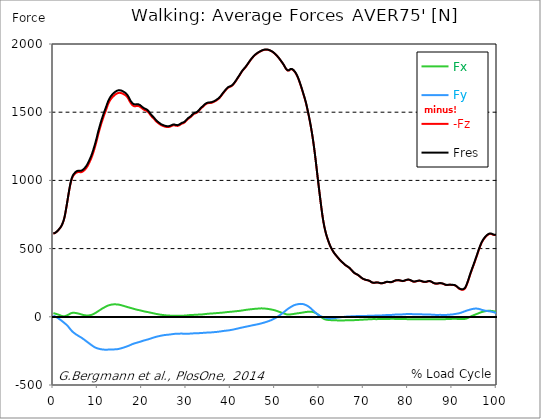
| Category |  Fx |  Fy |  -Fz |  Fres |
|---|---|---|---|---|
| 0.0 | 26.993 | 8.933 | 609.194 | 610.314 |
| 0.16678370786516855 | 25.712 | 6.523 | 611.267 | 612.345 |
| 0.3335674157303371 | 24.136 | 3.801 | 613.77 | 614.781 |
| 0.5003511235955057 | 22.375 | 1.037 | 616.677 | 617.629 |
| 0.6671348314606742 | 20.613 | -2.149 | 620.731 | 621.666 |
| 0.8339185393258427 | 19.02 | -5.444 | 625.307 | 626.217 |
| 1.0007022471910114 | 17.318 | -8.866 | 630.675 | 631.585 |
| 1.1674859550561796 | 15.473 | -12.658 | 636.911 | 637.838 |
| 1.3342696629213484 | 13.332 | -16.425 | 643.409 | 644.378 |
| 1.5010533707865168 | 11.107 | -19.947 | 649.695 | 650.707 |
| 1.6678370786516854 | 8.984 | -23.79 | 657.373 | 658.468 |
| 1.8346207865168538 | 7.104 | -28.063 | 666.777 | 667.974 |
| 2.001404494382023 | 5.385 | -32.546 | 677.699 | 679.039 |
| 2.1681882022471908 | 4.273 | -36.928 | 691.124 | 692.607 |
| 2.334971910112359 | 3.775 | -41.117 | 707.144 | 708.813 |
| 2.501755617977528 | 3.927 | -45.449 | 726.493 | 728.373 |
| 2.668539325842697 | 5.275 | -50.218 | 752.702 | 754.818 |
| 2.8353230337078656 | 7.29 | -55.014 | 782.973 | 785.341 |
| 3.0021067415730336 | 9.228 | -59.463 | 814.314 | 816.91 |
| 3.168890449438202 | 11.571 | -64.772 | 846.625 | 849.532 |
| 3.335674157303371 | 14.217 | -70.798 | 879.862 | 883.191 |
| 3.502457865168539 | 17.402 | -77.607 | 912.375 | 916.201 |
| 3.6692415730337076 | 20.731 | -84.644 | 943.168 | 947.559 |
| 3.8360252808988764 | 23.832 | -91.453 | 970.371 | 975.318 |
| 4.002808988764046 | 26.479 | -98.018 | 993.462 | 998.957 |
| 4.169592696629214 | 28.282 | -104.01 | 1011.48 | 1017.531 |
| 4.3363764044943816 | 29.192 | -109.269 | 1024.626 | 1031.208 |
| 4.50316011235955 | 29.344 | -113.895 | 1034.554 | 1041.591 |
| 4.669943820224718 | 29.234 | -118.235 | 1041.827 | 1049.302 |
| 4.836727528089888 | 28.931 | -122.449 | 1047.869 | 1055.765 |
| 5.003511235955056 | 28.282 | -126.536 | 1052.866 | 1061.193 |
| 5.170294943820225 | 27.304 | -130.109 | 1056.903 | 1065.6 |
| 5.337078651685394 | 26.066 | -133.413 | 1059.524 | 1068.583 |
| 5.5038623595505625 | 24.827 | -136.809 | 1060.628 | 1070.092 |
| 5.670646067415731 | 23.681 | -140.281 | 1061.235 | 1071.128 |
| 5.837429775280899 | 22.341 | -143.652 | 1061.311 | 1071.626 |
| 6.004213483146067 | 20.605 | -146.694 | 1060.139 | 1070.842 |
| 6.170997191011236 | 18.835 | -149.787 | 1059.381 | 1070.48 |
| 6.329002808988764 | 17.166 | -153.175 | 1060.139 | 1071.676 |
| 6.495786516853932 | 15.582 | -156.841 | 1062.431 | 1074.44 |
| 6.662570224719101 | 14.074 | -160.633 | 1065.76 | 1078.283 |
| 6.82935393258427 | 12.742 | -164.434 | 1069.906 | 1082.918 |
| 6.9961376404494375 | 11.68 | -168.378 | 1074.617 | 1088.152 |
| 7.162921348314607 | 10.905 | -172.49 | 1080.053 | 1094.135 |
| 7.329705056179775 | 10.366 | -176.679 | 1086.534 | 1101.189 |
| 7.496488764044945 | 10.029 | -180.875 | 1093.806 | 1109.026 |
| 7.663272471910113 | 9.843 | -184.996 | 1102.419 | 1118.187 |
| 7.830056179775281 | 9.936 | -189.05 | 1112.346 | 1128.628 |
| 7.996839887640449 | 10.34 | -193.095 | 1123.117 | 1139.921 |
| 8.16362359550562 | 10.972 | -197.115 | 1134.401 | 1151.727 |
| 8.330407303370787 | 11.925 | -201.126 | 1146.03 | 1163.879 |
| 8.497191011235955 | 13.265 | -205.129 | 1158.317 | 1176.681 |
| 8.663974719101123 | 14.992 | -209.099 | 1172.071 | 1190.931 |
| 8.830758426966291 | 16.973 | -212.916 | 1187.13 | 1206.446 |
| 8.99754213483146 | 19.45 | -216.599 | 1203.547 | 1223.284 |
| 9.16432584269663 | 22.273 | -219.97 | 1220.747 | 1240.846 |
| 9.331109550561798 | 25.181 | -223.088 | 1238.824 | 1259.243 |
| 9.497893258426966 | 28.299 | -225.835 | 1257.81 | 1278.482 |
| 9.664676966292134 | 31.653 | -228.254 | 1277.775 | 1298.649 |
| 9.831460674157304 | 35.176 | -230.335 | 1299.138 | 1320.147 |
| 9.998244382022472 | 38.85 | -231.928 | 1321.344 | 1342.412 |
| 10.16502808988764 | 42.415 | -233.403 | 1342.69 | 1363.817 |
| 10.331811797752808 | 45.777 | -234.92 | 1362.419 | 1383.622 |
| 10.498595505617978 | 49.35 | -236.218 | 1381.599 | 1402.861 |
| 10.665379213483147 | 52.966 | -237.279 | 1400.19 | 1421.477 |
| 10.832162921348315 | 56.514 | -238.249 | 1418.3 | 1439.621 |
| 10.998946629213483 | 59.927 | -239.074 | 1435.382 | 1456.729 |
| 11.165730337078653 | 63.011 | -239.85 | 1451.874 | 1473.229 |
| 11.33251404494382 | 65.944 | -240.381 | 1467.802 | 1489.148 |
| 11.49929775280899 | 68.902 | -240.777 | 1483.081 | 1504.41 |
| 11.666081460674157 | 71.784 | -241.046 | 1497.559 | 1518.855 |
| 11.832865168539326 | 74.632 | -241.266 | 1511.986 | 1533.232 |
| 11.999648876404493 | 77.371 | -241.282 | 1527.29 | 1548.443 |
| 12.166432584269662 | 80.051 | -241.105 | 1543.168 | 1564.185 |
| 12.333216292134832 | 82.512 | -240.575 | 1557.688 | 1578.537 |
| 12.5 | 84.543 | -240.17 | 1569.537 | 1590.259 |
| 12.66678370786517 | 86.093 | -240.001 | 1580.02 | 1600.659 |
| 12.833567415730336 | 87.476 | -239.909 | 1589.417 | 1609.988 |
| 13.000351123595506 | 88.697 | -239.858 | 1597.659 | 1618.179 |
| 13.167134831460674 | 89.734 | -239.799 | 1604.653 | 1625.132 |
| 13.333918539325843 | 90.509 | -239.639 | 1610.637 | 1631.056 |
| 13.500702247191011 | 91.091 | -239.336 | 1616.156 | 1636.492 |
| 13.667485955056181 | 91.386 | -238.973 | 1621.238 | 1641.489 |
| 13.834269662921349 | 91.453 | -238.704 | 1626.016 | 1646.175 |
| 14.001053370786519 | 91.335 | -238.594 | 1630.525 | 1650.599 |
| 14.167837078651687 | 91.108 | -238.274 | 1634.149 | 1654.13 |
| 14.334620786516853 | 90.636 | -237.768 | 1637.166 | 1657.012 |
| 14.501404494382026 | 90.037 | -236.993 | 1639.728 | 1659.405 |
| 14.668188202247192 | 89.515 | -236.015 | 1641.27 | 1660.762 |
| 14.834971910112362 | 88.681 | -234.81 | 1641.944 | 1661.2 |
| 15.001755617977528 | 87.568 | -233.538 | 1641.927 | 1660.956 |
| 15.168539325842698 | 86.321 | -232.172 | 1641.455 | 1660.231 |
| 15.335323033707864 | 84.888 | -230.563 | 1640.09 | 1658.596 |
| 15.502106741573034 | 83.329 | -228.987 | 1638.219 | 1656.456 |
| 15.6688904494382 | 81.678 | -227.394 | 1635.657 | 1653.624 |
| 15.83567415730337 | 79.992 | -225.709 | 1632.522 | 1650.22 |
| 16.00245786516854 | 78.399 | -223.922 | 1629.413 | 1646.832 |
| 16.16924157303371 | 76.798 | -222.043 | 1626.227 | 1643.36 |
| 16.336025280898877 | 75.138 | -220.079 | 1622.662 | 1639.509 |
| 16.502808988764045 | 73.629 | -218.175 | 1617.64 | 1634.242 |
| 16.669592696629216 | 71.978 | -216.203 | 1611.083 | 1627.432 |
| 16.83637640449438 | 70.444 | -214.248 | 1603.305 | 1619.418 |
| 17.003160112359552 | 68.902 | -212.149 | 1593.706 | 1609.592 |
| 17.169943820224717 | 67.334 | -209.865 | 1582.869 | 1598.518 |
| 17.336727528089888 | 65.817 | -207.354 | 1572.95 | 1588.321 |
| 17.503511235955056 | 64.317 | -204.817 | 1564.413 | 1579.498 |
| 17.670294943820224 | 62.809 | -202.374 | 1557.452 | 1572.233 |
| 17.837078651685395 | 61.283 | -200.09 | 1551.603 | 1566.098 |
| 18.003862359550563 | 59.716 | -198.059 | 1547.137 | 1561.371 |
| 18.17064606741573 | 58.157 | -196.255 | 1544.423 | 1558.404 |
| 18.3374297752809 | 56.615 | -194.511 | 1543.631 | 1557.351 |
| 18.504213483146067 | 55.115 | -192.792 | 1543.429 | 1556.896 |
| 18.662219101123597 | 53.598 | -191.233 | 1544.457 | 1557.663 |
| 18.829002808988765 | 52.157 | -189.842 | 1545.982 | 1558.96 |
| 18.995786516853933 | 50.901 | -188.207 | 1546.269 | 1559.011 |
| 19.1625702247191 | 49.831 | -186.623 | 1545.325 | 1557.856 |
| 19.32935393258427 | 48.853 | -185.165 | 1543.732 | 1556.087 |
| 19.49613764044944 | 47.682 | -183.64 | 1541.044 | 1553.204 |
| 19.662921348314608 | 46.485 | -181.92 | 1537.327 | 1549.286 |
| 19.829705056179776 | 45.162 | -180.117 | 1533.072 | 1544.811 |
| 19.996488764044944 | 43.78 | -178.263 | 1528.732 | 1540.26 |
| 20.163272471910112 | 42.373 | -176.401 | 1524.257 | 1535.566 |
| 20.33005617977528 | 40.889 | -174.681 | 1520.195 | 1531.302 |
| 20.49683988764045 | 39.583 | -173.207 | 1517.144 | 1528.083 |
| 20.663623595505616 | 38.37 | -171.757 | 1515.003 | 1525.765 |
| 20.830407303370787 | 37.341 | -170.173 | 1513.276 | 1523.844 |
| 20.997191011235955 | 36.448 | -168.74 | 1510.891 | 1521.282 |
| 21.163974719101123 | 35.487 | -167.501 | 1507.292 | 1517.532 |
| 21.330758426966295 | 34.4 | -166.094 | 1502.438 | 1512.517 |
| 21.497542134831463 | 33.263 | -164.257 | 1496.514 | 1506.382 |
| 21.66432584269663 | 32.142 | -162.42 | 1490.05 | 1499.716 |
| 21.8311095505618 | 30.928 | -160.515 | 1482.221 | 1491.685 |
| 21.997893258426966 | 29.715 | -158.585 | 1474.586 | 1483.839 |
| 22.164676966292134 | 28.619 | -156.976 | 1468.131 | 1477.215 |
| 22.331460674157306 | 27.406 | -155.282 | 1463.057 | 1471.94 |
| 22.498244382022467 | 26.15 | -153.453 | 1458.321 | 1466.993 |
| 22.66502808988764 | 24.928 | -151.708 | 1452.667 | 1461.153 |
| 22.831811797752806 | 23.731 | -150.048 | 1446.338 | 1454.655 |
| 22.99859550561798 | 22.501 | -148.405 | 1439.697 | 1447.855 |
| 23.165379213483146 | 21.321 | -146.812 | 1433.579 | 1441.576 |
| 23.332162921348313 | 20.251 | -145.405 | 1428.354 | 1436.208 |
| 23.49894662921348 | 19.273 | -144.149 | 1423.795 | 1431.531 |
| 23.665730337078653 | 18.313 | -142.969 | 1419.842 | 1427.452 |
| 23.83251404494382 | 17.293 | -141.739 | 1416.016 | 1423.5 |
| 23.999297752808985 | 16.315 | -140.483 | 1411.71 | 1419.075 |
| 24.166081460674157 | 15.447 | -139.278 | 1407.749 | 1414.997 |
| 24.332865168539325 | 14.731 | -138.174 | 1404.538 | 1411.676 |
| 24.499648876404496 | 14.015 | -137.129 | 1401.951 | 1408.979 |
| 24.666432584269664 | 13.307 | -136.059 | 1399.878 | 1406.788 |
| 24.833216292134832 | 12.641 | -135.022 | 1397.965 | 1404.766 |
| 25.0 | 12.026 | -134.188 | 1396.035 | 1402.743 |
| 25.16678370786517 | 11.352 | -133.514 | 1394.206 | 1400.847 |
| 25.33356741573034 | 10.753 | -132.932 | 1392.63 | 1399.221 |
| 25.500351123595504 | 10.315 | -132.461 | 1391.518 | 1398.058 |
| 25.66713483146067 | 9.927 | -132.005 | 1390.793 | 1397.291 |
| 25.833918539325843 | 9.548 | -131.475 | 1390.591 | 1397.029 |
| 26.00070224719101 | 9.186 | -130.851 | 1390.903 | 1397.274 |
| 26.16748595505618 | 8.84 | -130.101 | 1392.049 | 1398.344 |
| 26.334269662921347 | 8.562 | -129.418 | 1393.945 | 1400.164 |
| 26.50105337078652 | 8.326 | -128.82 | 1396.338 | 1402.49 |
| 26.667837078651687 | 8.04 | -128.07 | 1398.917 | 1404.985 |
| 26.834620786516858 | 7.719 | -127.227 | 1401.412 | 1407.378 |
| 27.001404494382022 | 7.391 | -126.359 | 1403.443 | 1409.308 |
| 27.16818820224719 | 7.188 | -125.668 | 1404.176 | 1409.965 |
| 27.334971910112362 | 7.138 | -125.213 | 1403.628 | 1409.376 |
| 27.50175561797753 | 7.155 | -124.884 | 1402.187 | 1407.901 |
| 27.668539325842698 | 7.172 | -124.724 | 1400.417 | 1406.123 |
| 27.835323033707866 | 7.18 | -124.623 | 1399.288 | 1404.976 |
| 28.002106741573037 | 7.146 | -124.48 | 1399.431 | 1405.103 |
| 28.168890449438205 | 7.012 | -124.193 | 1400.898 | 1406.535 |
| 28.335674157303373 | 6.953 | -123.89 | 1402.988 | 1408.592 |
| 28.502457865168537 | 6.969 | -123.561 | 1405.878 | 1411.432 |
| 28.669241573033705 | 7.037 | -123.292 | 1409.662 | 1415.182 |
| 28.836025280898877 | 7.138 | -123.115 | 1413.783 | 1419.269 |
| 29.002808988764052 | 7.399 | -123.165 | 1416.572 | 1422.05 |
| 29.169592696629213 | 7.837 | -123.46 | 1418.081 | 1423.576 |
| 29.336376404494384 | 8.309 | -123.789 | 1419.674 | 1425.194 |
| 29.50316011235955 | 8.705 | -123.957 | 1422.387 | 1427.907 |
| 29.669943820224724 | 9.009 | -123.856 | 1426.407 | 1431.902 |
| 29.836727528089884 | 9.371 | -123.646 | 1431.666 | 1437.127 |
| 30.003511235955056 | 9.894 | -123.578 | 1437.919 | 1443.354 |
| 30.170294943820224 | 10.484 | -123.654 | 1444.062 | 1449.49 |
| 30.337078651685395 | 11.099 | -123.738 | 1449.633 | 1455.043 |
| 30.503862359550563 | 11.756 | -123.629 | 1453.771 | 1459.172 |
| 30.670646067415728 | 12.354 | -123.561 | 1457.243 | 1462.628 |
| 30.837429775280903 | 12.818 | -123.342 | 1460.723 | 1466.091 |
| 30.99543539325843 | 13.113 | -122.921 | 1465.341 | 1470.659 |
| 31.162219101123597 | 13.265 | -122.381 | 1471.063 | 1476.314 |
| 31.32900280898876 | 13.458 | -121.859 | 1477.005 | 1482.204 |
| 31.495786516853936 | 13.728 | -121.497 | 1482.238 | 1487.396 |
| 31.6625702247191 | 14.107 | -121.353 | 1486.342 | 1491.474 |
| 31.82935393258427 | 14.453 | -121.193 | 1489.384 | 1494.508 |
| 31.996137640449433 | 14.756 | -121.084 | 1491.458 | 1496.564 |
| 32.162921348314605 | 15.017 | -120.999 | 1493.177 | 1498.284 |
| 32.329705056179776 | 15.22 | -120.806 | 1495.435 | 1500.517 |
| 32.49648876404494 | 15.498 | -120.586 | 1498.916 | 1503.981 |
| 32.66327247191011 | 15.944 | -120.435 | 1503.795 | 1508.835 |
| 32.83005617977528 | 16.383 | -120.207 | 1509.728 | 1514.742 |
| 32.996839887640455 | 16.526 | -119.567 | 1516.36 | 1521.316 |
| 33.16362359550562 | 16.711 | -119.011 | 1522.984 | 1527.889 |
| 33.330407303370784 | 16.981 | -118.581 | 1528.833 | 1533.695 |
| 33.497191011235955 | 17.284 | -118.218 | 1533.569 | 1538.406 |
| 33.66397471910113 | 17.756 | -118.033 | 1537.892 | 1542.712 |
| 33.83075842696629 | 18.388 | -117.772 | 1542.881 | 1547.668 |
| 33.997542134831455 | 19.088 | -117.291 | 1548.662 | 1553.407 |
| 34.164325842696634 | 19.745 | -116.887 | 1553.575 | 1558.286 |
| 34.3311095505618 | 20.386 | -116.499 | 1557.823 | 1562.5 |
| 34.49789325842697 | 21.026 | -116.078 | 1561.278 | 1565.921 |
| 34.66467696629213 | 21.549 | -115.724 | 1563.755 | 1568.365 |
| 34.831460674157306 | 22.063 | -115.463 | 1565.618 | 1570.211 |
| 34.99824438202247 | 22.551 | -115.395 | 1566.789 | 1571.382 |
| 35.16502808988764 | 23.04 | -115.345 | 1567.396 | 1571.989 |
| 35.331811797752806 | 23.563 | -115.067 | 1567.506 | 1572.09 |
| 35.49859550561798 | 24.068 | -114.679 | 1567.598 | 1572.166 |
| 35.66537921348315 | 24.439 | -114.173 | 1568.492 | 1573.026 |
| 35.83216292134831 | 24.768 | -113.76 | 1570.303 | 1574.821 |
| 35.998946629213485 | 25.004 | -113.263 | 1572.621 | 1577.096 |
| 36.16573033707865 | 25.231 | -112.766 | 1575.099 | 1579.54 |
| 36.33251404494382 | 25.611 | -112.227 | 1577.627 | 1582.026 |
| 36.499297752808985 | 26.133 | -111.738 | 1580.357 | 1584.723 |
| 36.666081460674164 | 26.715 | -111.325 | 1583.644 | 1587.984 |
| 36.83286516853932 | 27.229 | -110.853 | 1587.403 | 1591.709 |
| 36.99964887640449 | 27.616 | -110.246 | 1591.574 | 1595.83 |
| 37.166432584269664 | 28.021 | -109.606 | 1595.476 | 1599.698 |
| 37.333216292134836 | 28.408 | -108.889 | 1599.58 | 1603.751 |
| 37.5 | 28.788 | -108.181 | 1605.075 | 1609.187 |
| 37.666783707865164 | 29.226 | -107.364 | 1611.471 | 1615.533 |
| 37.833567415730336 | 29.63 | -106.572 | 1618.171 | 1622.174 |
| 38.00035112359551 | 30.069 | -105.729 | 1625.452 | 1629.404 |
| 38.16713483146068 | 30.591 | -104.726 | 1633.18 | 1637.073 |
| 38.333918539325836 | 31.139 | -103.883 | 1640.25 | 1644.076 |
| 38.50070224719101 | 31.754 | -103.268 | 1646.621 | 1650.405 |
| 38.66748595505618 | 32.47 | -102.729 | 1653.051 | 1656.81 |
| 38.83426966292135 | 33.187 | -102.156 | 1659.953 | 1663.678 |
| 39.001053370786515 | 33.802 | -101.524 | 1666.56 | 1670.243 |
| 39.16783707865169 | 34.4 | -100.951 | 1672.358 | 1676.007 |
| 39.33462078651686 | 34.99 | -100.293 | 1677.297 | 1680.904 |
| 39.50140449438202 | 35.462 | -99.501 | 1681.502 | 1685.058 |
| 39.668188202247194 | 35.934 | -98.836 | 1683.921 | 1687.443 |
| 39.83497191011236 | 36.381 | -98.086 | 1685.85 | 1689.331 |
| 40.00175561797753 | 36.768 | -97.041 | 1688.1 | 1691.539 |
| 40.168539325842694 | 37.257 | -95.97 | 1691.025 | 1694.396 |
| 40.335323033707866 | 37.83 | -94.908 | 1694.59 | 1697.91 |
| 40.50210674157304 | 38.42 | -93.847 | 1699.696 | 1702.966 |
| 40.6688904494382 | 38.985 | -92.759 | 1705.891 | 1709.101 |
| 40.83567415730337 | 39.558 | -91.605 | 1713.037 | 1716.189 |
| 41.00245786516854 | 40.232 | -90.467 | 1720.512 | 1723.613 |
| 41.16924157303371 | 40.822 | -89.22 | 1728.509 | 1731.543 |
| 41.33602528089887 | 41.361 | -87.956 | 1736.81 | 1739.794 |
| 41.502808988764045 | 41.901 | -86.709 | 1745.196 | 1748.12 |
| 41.669592696629216 | 42.44 | -85.369 | 1753.463 | 1756.328 |
| 41.83637640449439 | 42.971 | -84.012 | 1761.545 | 1764.351 |
| 42.00316011235955 | 43.544 | -82.638 | 1769.947 | 1772.702 |
| 42.16994382022472 | 44.26 | -81.349 | 1778.719 | 1781.425 |
| 42.33672752808989 | 45.103 | -80.177 | 1787.467 | 1790.13 |
| 42.50351123595506 | 45.946 | -79.04 | 1795.81 | 1798.439 |
| 42.670294943820224 | 46.822 | -77.902 | 1803.605 | 1806.201 |
| 42.83707865168539 | 47.69 | -76.79 | 1810.465 | 1813.019 |
| 43.00386235955057 | 48.533 | -75.686 | 1816.398 | 1818.918 |
| 43.17064606741573 | 49.409 | -74.573 | 1822.263 | 1824.766 |
| 43.32865168539326 | 50.277 | -73.444 | 1828.592 | 1831.07 |
| 43.495435393258425 | 51.019 | -72.273 | 1835.932 | 1838.376 |
| 43.6622191011236 | 51.752 | -71.101 | 1843.627 | 1846.045 |
| 43.82900280898876 | 52.452 | -69.947 | 1851.456 | 1853.832 |
| 43.99578651685393 | 53.159 | -68.834 | 1859.234 | 1861.585 |
| 44.162570224719104 | 53.808 | -67.688 | 1866.945 | 1869.262 |
| 44.32935393258427 | 54.407 | -66.517 | 1874.732 | 1877.024 |
| 44.49613764044944 | 54.997 | -65.329 | 1882.392 | 1884.659 |
| 44.66292134831461 | 55.578 | -64.098 | 1889.53 | 1891.755 |
| 44.82970505617978 | 56.168 | -62.918 | 1896.205 | 1898.404 |
| 44.99648876404493 | 56.766 | -61.789 | 1902.508 | 1904.674 |
| 45.16327247191011 | 57.356 | -60.71 | 1908.458 | 1910.607 |
| 45.33005617977528 | 57.929 | -59.682 | 1914.054 | 1916.177 |
| 45.49683988764045 | 58.452 | -58.679 | 1919.085 | 1921.192 |
| 45.66362359550561 | 58.941 | -57.634 | 1923.374 | 1925.447 |
| 45.83040730337079 | 59.37 | -56.547 | 1927.512 | 1929.568 |
| 45.99719101123596 | 59.708 | -55.41 | 1931.7 | 1933.731 |
| 46.16397471910113 | 59.994 | -54.263 | 1935.754 | 1937.743 |
| 46.33075842696629 | 60.407 | -53.075 | 1938.965 | 1940.928 |
| 46.497542134831455 | 61.182 | -51.862 | 1941.704 | 1943.659 |
| 46.66432584269663 | 61.663 | -50.336 | 1944.4 | 1946.313 |
| 46.83110955056179 | 61.814 | -48.836 | 1947.485 | 1949.347 |
| 46.99789325842696 | 61.814 | -47.42 | 1950.476 | 1952.305 |
| 47.164676966292134 | 61.621 | -45.996 | 1952.87 | 1954.648 |
| 47.331460674157306 | 61.334 | -44.437 | 1954.859 | 1956.595 |
| 47.49824438202247 | 61.014 | -42.895 | 1956.485 | 1958.179 |
| 47.66502808988764 | 60.626 | -41.294 | 1957.673 | 1959.317 |
| 47.83181179775281 | 60.078 | -39.566 | 1958.407 | 1959.991 |
| 47.99859550561797 | 59.421 | -37.729 | 1958.693 | 1960.21 |
| 48.16537921348314 | 58.781 | -36.077 | 1958.449 | 1959.923 |
| 48.33216292134831 | 58.14 | -34.4 | 1957.758 | 1959.19 |
| 48.498946629213485 | 57.365 | -32.454 | 1956.536 | 1957.909 |
| 48.66573033707865 | 56.421 | -30.372 | 1954.884 | 1956.224 |
| 48.83251404494382 | 55.469 | -28.358 | 1952.811 | 1954.117 |
| 48.99929775280899 | 54.516 | -26.394 | 1950.325 | 1951.589 |
| 49.166081460674164 | 53.606 | -24.38 | 1947.527 | 1948.757 |
| 49.33286516853933 | 52.468 | -21.869 | 1944.434 | 1945.631 |
| 49.499648876404486 | 51.23 | -19.138 | 1941.004 | 1942.159 |
| 49.666432584269664 | 49.974 | -16.433 | 1936.959 | 1938.08 |
| 49.83321629213483 | 48.626 | -13.694 | 1932.358 | 1933.42 |
| 50.0 | 47.218 | -10.888 | 1927.52 | 1928.515 |
| 50.166783707865164 | 45.634 | -7.829 | 1922.371 | 1923.307 |
| 50.33356741573034 | 43.906 | -4.601 | 1916.902 | 1917.778 |
| 50.50035112359551 | 42.002 | -1.256 | 1911.214 | 1912.031 |
| 50.66713483146068 | 39.971 | 2.351 | 1904.952 | 1905.719 |
| 50.83391853932584 | 37.931 | 6.085 | 1898.244 | 1898.977 |
| 51.00070224719101 | 35.884 | 9.885 | 1891.317 | 1892.016 |
| 51.16748595505618 | 33.844 | 13.737 | 1884.204 | 1884.878 |
| 51.33426966292134 | 31.864 | 17.672 | 1876.805 | 1877.462 |
| 51.50105337078652 | 29.984 | 21.624 | 1869.187 | 1869.852 |
| 51.66783707865169 | 28.206 | 25.594 | 1861.45 | 1862.108 |
| 51.83462078651686 | 26.453 | 29.723 | 1853.453 | 1854.127 |
| 52.00140449438202 | 24.566 | 33.996 | 1845.042 | 1845.742 |
| 52.168188202247194 | 22.484 | 38.589 | 1835.241 | 1835.983 |
| 52.33497191011236 | 20.47 | 43.257 | 1825.66 | 1826.46 |
| 52.50175561797752 | 18.692 | 47.909 | 1817.198 | 1818.092 |
| 52.668539325842694 | 17.453 | 52.123 | 1811.122 | 1812.117 |
| 52.835323033707866 | 16.501 | 56.16 | 1806.437 | 1807.541 |
| 53.00210674157304 | 15.953 | 60.028 | 1804.01 | 1805.232 |
| 53.1688904494382 | 16.265 | 63.761 | 1806.42 | 1807.777 |
| 53.33567415730337 | 16.989 | 67.208 | 1810.718 | 1812.21 |
| 53.502457865168545 | 17.824 | 70.52 | 1815.05 | 1816.676 |
| 53.669241573033716 | 18.405 | 73.832 | 1816.786 | 1818.538 |
| 53.83602528089887 | 19.071 | 77 | 1815.066 | 1816.954 |
| 54.002808988764045 | 19.754 | 80.11 | 1811.535 | 1813.566 |
| 54.169592696629216 | 20.521 | 82.773 | 1806.875 | 1809.049 |
| 54.33637640449438 | 21.431 | 85.301 | 1800.984 | 1803.302 |
| 54.50316011235955 | 22.417 | 87.366 | 1793.964 | 1796.4 |
| 54.669943820224724 | 23.361 | 88.976 | 1785.739 | 1788.276 |
| 54.836727528089895 | 24.237 | 90.206 | 1776.141 | 1778.77 |
| 55.00351123595506 | 25.122 | 91.184 | 1765.32 | 1768.017 |
| 55.17029494382022 | 25.922 | 92.212 | 1753.21 | 1755.991 |
| 55.337078651685395 | 26.605 | 93.332 | 1739.364 | 1742.229 |
| 55.50386235955056 | 27.304 | 94.276 | 1723.942 | 1726.9 |
| 55.66186797752809 | 28.156 | 94.799 | 1708.124 | 1711.166 |
| 55.82865168539326 | 29.057 | 94.479 | 1691.952 | 1695.028 |
| 55.995435393258425 | 29.866 | 94.074 | 1675.122 | 1678.232 |
| 56.1622191011236 | 30.692 | 93.602 | 1657.914 | 1661.049 |
| 56.32900280898877 | 31.543 | 93.097 | 1640.014 | 1643.174 |
| 56.49578651685393 | 32.513 | 91.925 | 1621.837 | 1624.988 |
| 56.6625702247191 | 33.617 | 90.08 | 1604.114 | 1607.215 |
| 56.82935393258427 | 34.56 | 87.872 | 1585.152 | 1588.186 |
| 56.99613764044943 | 35.369 | 85.453 | 1564.75 | 1567.708 |
| 57.16292134831461 | 35.934 | 82.748 | 1541.566 | 1544.432 |
| 57.329705056179776 | 36.339 | 79.958 | 1516.975 | 1519.765 |
| 57.49648876404495 | 36.827 | 76.596 | 1491.887 | 1494.567 |
| 57.66327247191011 | 37.266 | 72.922 | 1465.948 | 1468.502 |
| 57.83005617977529 | 37.603 | 68.573 | 1438.526 | 1440.911 |
| 57.99683988764044 | 37.611 | 64.09 | 1409.401 | 1411.609 |
| 58.16362359550561 | 37.35 | 59.438 | 1379.197 | 1381.211 |
| 58.33040730337079 | 36.844 | 54.306 | 1347.056 | 1348.859 |
| 58.497191011235955 | 35.867 | 49.157 | 1312.386 | 1313.978 |
| 58.66397471910112 | 34.493 | 43.982 | 1275.297 | 1276.687 |
| 58.83075842696629 | 32.656 | 38.892 | 1235.528 | 1236.725 |
| 58.99754213483147 | 30.254 | 34.114 | 1193.493 | 1194.513 |
| 59.164325842696634 | 27.33 | 29.555 | 1148.929 | 1149.789 |
| 59.33110955056179 | 24.186 | 25.105 | 1103.135 | 1103.835 |
| 59.49789325842697 | 20.815 | 20.765 | 1056.659 | 1057.223 |
| 59.664676966292134 | 17.192 | 16.602 | 1009.921 | 1010.351 |
| 59.8314606741573 | 13.29 | 12.919 | 964.632 | 964.953 |
| 59.99824438202247 | 9.144 | 9.7 | 919.867 | 920.111 |
| 60.16502808988765 | 4.947 | 6.733 | 875.825 | 876.028 |
| 60.33181179775281 | 0.699 | 4.011 | 832.29 | 832.467 |
| 60.49859550561798 | -3.472 | 1.567 | 789.934 | 790.103 |
| 60.66537921348315 | -7.585 | -0.455 | 750.006 | 750.199 |
| 60.83216292134831 | -11.402 | -2.191 | 713.869 | 714.114 |
| 60.99894662921348 | -14.605 | -3.792 | 682.562 | 682.865 |
| 61.16573033707864 | -17.209 | -5.427 | 655.325 | 655.712 |
| 61.33251404494383 | -19.214 | -7.062 | 631.374 | 631.846 |
| 61.49929775280899 | -20.79 | -8.579 | 609.632 | 610.171 |
| 61.66608146067416 | -21.86 | -9.919 | 590.637 | 591.235 |
| 61.83286516853932 | -22.594 | -10.964 | 573.849 | 574.507 |
| 61.99964887640451 | -23.175 | -11.748 | 558.251 | 558.958 |
| 62.16643258426967 | -23.681 | -12.363 | 543.132 | 543.89 |
| 62.33321629213482 | -24.102 | -12.793 | 528.696 | 529.497 |
| 62.5 | -24.321 | -12.869 | 515.979 | 516.805 |
| 62.66678370786517 | -24.439 | -12.708 | 504.796 | 505.639 |
| 62.833567415730336 | -24.582 | -12.338 | 494.624 | 495.484 |
| 63.0003511235955 | -24.776 | -11.807 | 484.958 | 485.826 |
| 63.16713483146068 | -24.987 | -11.132 | 476.278 | 477.154 |
| 63.33391853932585 | -25.248 | -10.273 | 468.188 | 469.081 |
| 63.500702247191015 | -25.526 | -9.337 | 460.561 | 461.463 |
| 63.66748595505618 | -25.754 | -8.351 | 453.6 | 454.519 |
| 63.83426966292135 | -26.007 | -7.357 | 447.077 | 448.013 |
| 64.00105337078651 | -26.226 | -6.481 | 440.723 | 441.667 |
| 64.16783707865169 | -26.302 | -5.705 | 434.125 | 435.085 |
| 64.33462078651687 | -26.293 | -4.989 | 427.534 | 428.495 |
| 64.50140449438203 | -26.361 | -4.323 | 421.265 | 422.242 |
| 64.6681882022472 | -26.403 | -3.666 | 415.273 | 416.259 |
| 64.83497191011236 | -26.495 | -3.034 | 409.635 | 410.638 |
| 65.00175561797754 | -26.63 | -2.427 | 404.418 | 405.43 |
| 65.16853932584269 | -26.664 | -1.862 | 399.472 | 400.491 |
| 65.33532303370787 | -26.622 | -1.332 | 394.643 | 395.662 |
| 65.50210674157304 | -26.529 | -0.742 | 389.687 | 390.699 |
| 65.66889044943821 | -26.327 | -0.169 | 384.538 | 385.55 |
| 65.83567415730337 | -26.066 | 0.413 | 379.608 | 380.611 |
| 66.00245786516854 | -25.88 | 0.994 | 375.412 | 376.398 |
| 66.1692415730337 | -25.695 | 1.492 | 371.889 | 372.875 |
| 66.33602528089888 | -25.501 | 1.997 | 368.535 | 369.504 |
| 66.50280898876404 | -25.358 | 2.419 | 365.105 | 366.074 |
| 66.66959269662921 | -25.282 | 2.714 | 361.363 | 362.332 |
| 66.83637640449439 | -25.215 | 2.899 | 356.829 | 357.807 |
| 67.00316011235955 | -25.164 | 3.042 | 351.377 | 352.371 |
| 67.16994382022472 | -25.164 | 3.202 | 345.528 | 346.54 |
| 67.33672752808988 | -25.097 | 3.421 | 339.486 | 340.506 |
| 67.50351123595506 | -24.97 | 3.615 | 333.444 | 334.472 |
| 67.67029494382022 | -24.776 | 3.801 | 327.764 | 328.8 |
| 67.83707865168539 | -24.557 | 4.062 | 322.724 | 323.761 |
| 67.99508426966291 | -24.321 | 4.374 | 318.451 | 319.488 |
| 68.16186797752809 | -24.043 | 4.761 | 315.072 | 316.1 |
| 68.32865168539327 | -23.824 | 5.149 | 312.325 | 313.353 |
| 68.49543539325843 | -23.622 | 5.393 | 310.075 | 311.103 |
| 68.6622191011236 | -23.369 | 5.562 | 307.53 | 308.549 |
| 68.82900280898876 | -22.99 | 5.646 | 303.746 | 304.74 |
| 68.99578651685394 | -22.602 | 5.604 | 299.347 | 300.333 |
| 69.1625702247191 | -22.24 | 5.579 | 294.61 | 295.58 |
| 69.32935393258425 | -21.978 | 5.613 | 289.9 | 290.869 |
| 69.49613764044945 | -21.742 | 5.646 | 285.56 | 286.52 |
| 69.66292134831461 | -21.405 | 5.697 | 281.691 | 282.652 |
| 69.82970505617978 | -21.009 | 5.79 | 278.472 | 279.408 |
| 69.99648876404494 | -20.655 | 5.891 | 275.893 | 276.82 |
| 70.16327247191012 | -20.301 | 6.051 | 273.744 | 274.655 |
| 70.33005617977528 | -19.939 | 6.219 | 271.756 | 272.649 |
| 70.49683988764045 | -19.594 | 6.388 | 270.011 | 270.896 |
| 70.66362359550561 | -19.29 | 6.59 | 268.696 | 269.556 |
| 70.83040730337079 | -19.02 | 6.826 | 267.828 | 268.68 |
| 70.99719101123596 | -18.751 | 7.079 | 266.901 | 267.744 |
| 71.16397471910112 | -18.447 | 7.306 | 265.081 | 265.915 |
| 71.3307584269663 | -18.11 | 7.483 | 262.494 | 263.311 |
| 71.49754213483146 | -17.782 | 7.568 | 259.292 | 260.092 |
| 71.66432584269663 | -17.487 | 7.601 | 255.575 | 256.376 |
| 71.83110955056179 | -17.225 | 7.652 | 252.078 | 252.87 |
| 71.99789325842697 | -17.048 | 7.787 | 249.693 | 250.485 |
| 72.16467696629215 | -16.939 | 8.006 | 248.842 | 249.634 |
| 72.3314606741573 | -16.888 | 8.284 | 248.69 | 249.491 |
| 72.49824438202248 | -16.947 | 8.672 | 249.229 | 250.038 |
| 72.66502808988764 | -17.065 | 9.152 | 250.316 | 251.151 |
| 72.8318117977528 | -17.175 | 9.632 | 251.538 | 252.39 |
| 72.99859550561797 | -17.141 | 10.037 | 251.909 | 252.769 |
| 73.16537921348315 | -16.93 | 10.214 | 251.319 | 252.171 |
| 73.33216292134833 | -16.61 | 10.256 | 250.022 | 250.856 |
| 73.49894662921349 | -16.231 | 10.231 | 248.471 | 249.28 |
| 73.66573033707864 | -15.843 | 10.214 | 246.819 | 247.611 |
| 73.83251404494382 | -15.515 | 10.18 | 245.53 | 246.297 |
| 73.99929775280899 | -15.312 | 10.248 | 245.1 | 245.858 |
| 74.16608146067415 | -15.279 | 10.458 | 245.597 | 246.356 |
| 74.33286516853933 | -15.329 | 10.736 | 246.516 | 247.291 |
| 74.49964887640449 | -15.473 | 11.116 | 247.982 | 248.774 |
| 74.66643258426967 | -15.599 | 11.503 | 249.752 | 250.561 |
| 74.83321629213484 | -15.81 | 11.958 | 251.715 | 252.55 |
| 75.0 | -16.054 | 12.439 | 253.687 | 254.555 |
| 75.16678370786516 | -16.18 | 12.894 | 255.272 | 256.157 |
| 75.33356741573033 | -16.147 | 13.197 | 255.853 | 256.747 |
| 75.5003511235955 | -15.953 | 13.349 | 255.415 | 256.308 |
| 75.66713483146067 | -15.717 | 13.425 | 254.581 | 255.474 |
| 75.83391853932585 | -15.456 | 13.467 | 253.696 | 254.572 |
| 76.00070224719101 | -15.228 | 13.509 | 253.207 | 254.075 |
| 76.16748595505618 | -14.984 | 13.661 | 253.258 | 254.117 |
| 76.33426966292136 | -14.84 | 13.922 | 254.218 | 255.086 |
| 76.50105337078652 | -14.84 | 14.318 | 256.123 | 256.999 |
| 76.66783707865167 | -14.958 | 14.79 | 258.491 | 259.401 |
| 76.83462078651685 | -15.169 | 15.321 | 261.221 | 262.165 |
| 77.00140449438202 | -15.38 | 15.843 | 263.8 | 264.786 |
| 77.1681882022472 | -15.515 | 16.273 | 265.679 | 266.691 |
| 77.33497191011236 | -15.582 | 16.551 | 266.859 | 267.879 |
| 77.50175561797754 | -15.565 | 16.821 | 267.5 | 268.545 |
| 77.6685393258427 | -15.607 | 17.057 | 267.871 | 268.932 |
| 77.83532303370787 | -15.7 | 17.259 | 267.837 | 268.916 |
| 78.00210674157303 | -15.81 | 17.394 | 267.112 | 268.208 |
| 78.1688904494382 | -15.81 | 17.487 | 266.017 | 267.129 |
| 78.33567415730337 | -15.81 | 17.554 | 264.845 | 265.958 |
| 78.50245786516854 | -15.768 | 17.563 | 263.337 | 264.458 |
| 78.66924157303372 | -15.725 | 17.605 | 261.988 | 263.109 |
| 78.83602528089888 | -15.768 | 17.79 | 261.508 | 262.646 |
| 79.00280898876404 | -15.919 | 18.102 | 262.132 | 263.295 |
| 79.16959269662921 | -16.147 | 18.532 | 263.674 | 264.87 |
| 79.33637640449439 | -16.4 | 19.012 | 265.713 | 266.952 |
| 79.50316011235955 | -16.678 | 19.543 | 267.845 | 269.126 |
| 79.66994382022472 | -16.973 | 20.023 | 269.809 | 271.132 |
| 79.8367275280899 | -17.209 | 20.31 | 271.107 | 272.455 |
| 80.00351123595506 | -17.36 | 20.436 | 271.621 | 272.994 |
| 80.17029494382022 | -17.529 | 20.487 | 271.385 | 272.775 |
| 80.32830056179776 | -17.874 | 20.419 | 270.365 | 271.781 |
| 80.49508426966293 | -18.186 | 20.268 | 268.402 | 269.834 |
| 80.66186797752809 | -18.422 | 20.04 | 265.856 | 267.306 |
| 80.82865168539325 | -18.633 | 19.779 | 263.067 | 264.525 |
| 80.99543539325842 | -18.759 | 19.568 | 260.261 | 261.727 |
| 81.1622191011236 | -18.835 | 19.349 | 257.985 | 259.46 |
| 81.32900280898878 | -18.843 | 19.181 | 256.595 | 258.061 |
| 81.49578651685394 | -18.843 | 19.189 | 256.898 | 258.365 |
| 81.6625702247191 | -18.835 | 19.315 | 258.213 | 259.679 |
| 81.82935393258427 | -18.776 | 19.358 | 259.764 | 261.221 |
| 81.99613764044945 | -18.675 | 19.307 | 260.935 | 262.376 |
| 82.16292134831461 | -18.65 | 19.282 | 262.233 | 263.665 |
| 82.32970505617978 | -18.709 | 19.29 | 263.665 | 265.098 |
| 82.49648876404494 | -18.683 | 19.181 | 264.508 | 265.924 |
| 82.66327247191012 | -18.666 | 18.936 | 264.213 | 265.612 |
| 82.83005617977528 | -18.65 | 18.624 | 263.126 | 264.508 |
| 82.99683988764045 | -18.582 | 18.22 | 261.483 | 262.848 |
| 83.16362359550563 | -18.473 | 17.824 | 259.511 | 260.851 |
| 83.33040730337079 | -18.329 | 17.495 | 257.513 | 258.828 |
| 83.49719101123596 | -18.203 | 17.242 | 256.072 | 257.37 |
| 83.66397471910112 | -18.034 | 17.023 | 255.204 | 256.485 |
| 83.8307584269663 | -17.832 | 16.804 | 254.766 | 256.013 |
| 83.99754213483146 | -17.647 | 16.686 | 255.011 | 256.249 |
| 84.16432584269663 | -17.605 | 16.72 | 256.173 | 257.404 |
| 84.33110955056179 | -17.697 | 16.787 | 257.8 | 259.039 |
| 84.49789325842697 | -17.798 | 16.838 | 259.696 | 260.926 |
| 84.66467696629213 | -17.883 | 16.838 | 261.103 | 262.334 |
| 84.8314606741573 | -17.95 | 16.72 | 261.221 | 262.443 |
| 84.99824438202248 | -18.06 | 16.459 | 260.387 | 261.609 |
| 85.16502808988764 | -18.127 | 16.121 | 258.617 | 259.831 |
| 85.3318117977528 | -18.127 | 15.725 | 255.718 | 256.924 |
| 85.49859550561797 | -18.051 | 15.338 | 252.297 | 253.485 |
| 85.66537921348315 | -17.942 | 14.942 | 248.842 | 250.022 |
| 85.83216292134831 | -17.883 | 14.588 | 246.356 | 247.519 |
| 85.99894662921348 | -17.815 | 14.318 | 244.611 | 245.766 |
| 86.16573033707866 | -17.706 | 14.006 | 243.263 | 244.401 |
| 86.33251404494384 | -17.714 | 13.829 | 242.656 | 243.785 |
| 86.499297752809 | -17.79 | 13.77 | 242.664 | 243.794 |
| 86.66608146067415 | -17.815 | 13.762 | 243.086 | 244.215 |
| 86.83286516853933 | -17.849 | 13.888 | 244.097 | 245.226 |
| 86.99964887640449 | -17.874 | 14.082 | 245.269 | 246.406 |
| 87.16643258426966 | -17.908 | 14.208 | 246.069 | 247.207 |
| 87.33321629213482 | -17.95 | 14.166 | 246.187 | 247.325 |
| 87.5 | -17.841 | 14.04 | 245.496 | 246.625 |
| 87.66678370786518 | -17.664 | 13.846 | 244.476 | 245.589 |
| 87.83356741573033 | -17.537 | 13.703 | 243.103 | 244.207 |
| 88.00035112359551 | -17.487 | 13.619 | 241.114 | 242.218 |
| 88.16713483146067 | -17.419 | 13.56 | 238.383 | 239.496 |
| 88.33391853932584 | -17.318 | 13.534 | 235.552 | 236.681 |
| 88.500702247191 | -17.141 | 13.576 | 233.538 | 234.675 |
| 88.66748595505618 | -16.787 | 13.72 | 232.72 | 233.841 |
| 88.83426966292136 | -16.45 | 14.031 | 232.594 | 233.715 |
| 89.00105337078652 | -16.223 | 14.537 | 233.099 | 234.237 |
| 89.16783707865169 | -16.054 | 15.093 | 233.968 | 235.13 |
| 89.33462078651687 | -15.944 | 15.574 | 234.768 | 235.965 |
| 89.50140449438203 | -15.768 | 15.944 | 234.878 | 236.083 |
| 89.6681882022472 | -15.532 | 16.231 | 234.355 | 235.577 |
| 89.83497191011236 | -15.27 | 16.636 | 233.352 | 234.583 |
| 90.00175561797754 | -15.051 | 17.183 | 232.602 | 233.866 |
| 90.16853932584269 | -14.95 | 17.984 | 232.788 | 234.119 |
| 90.33532303370787 | -14.925 | 18.953 | 233.091 | 234.507 |
| 90.50210674157303 | -14.967 | 19.905 | 231.835 | 233.352 |
| 90.6688904494382 | -14.95 | 20.832 | 229.097 | 230.723 |
| 90.83567415730336 | -15.017 | 21.683 | 225.675 | 227.411 |
| 91.00245786516854 | -15.237 | 22.56 | 221.773 | 223.652 |
| 91.1692415730337 | -15.464 | 23.512 | 216.776 | 218.84 |
| 91.33602528089888 | -15.709 | 24.498 | 211.719 | 213.978 |
| 91.50280898876404 | -16.003 | 25.695 | 206.933 | 209.436 |
| 91.66959269662922 | -16.206 | 27.085 | 203.444 | 206.191 |
| 91.83637640449439 | -16.383 | 28.56 | 200.89 | 203.89 |
| 92.00316011235955 | -16.459 | 30.355 | 199.222 | 202.525 |
| 92.16994382022472 | -16.551 | 32.336 | 198.118 | 201.758 |
| 92.3367275280899 | -16.61 | 34.459 | 197.966 | 201.977 |
| 92.50351123595506 | -16.543 | 36.566 | 198.859 | 203.208 |
| 92.66151685393258 | -16.341 | 38.488 | 201.042 | 205.66 |
| 92.82830056179776 | -15.7 | 40.443 | 206.073 | 210.91 |
| 92.99508426966291 | -14.47 | 42.398 | 214.871 | 219.843 |
| 93.16186797752809 | -12.86 | 44.463 | 226.728 | 231.81 |
| 93.32865168539325 | -10.888 | 46.35 | 240.398 | 245.521 |
| 93.49543539325842 | -8.512 | 47.985 | 255.634 | 260.716 |
| 93.66221910112358 | -5.806 | 49.494 | 271.874 | 276.871 |
| 93.82900280898876 | -2.966 | 51.061 | 288.619 | 293.54 |
| 93.99578651685393 | -0.135 | 52.688 | 305.397 | 310.26 |
| 94.1625702247191 | 2.52 | 54.213 | 321.451 | 326.297 |
| 94.32935393258427 | 4.989 | 55.595 | 336.73 | 341.601 |
| 94.49613764044945 | 7.391 | 56.775 | 351.756 | 356.652 |
| 94.66292134831461 | 9.675 | 57.896 | 366.42 | 371.35 |
| 94.82970505617978 | 11.849 | 58.873 | 381.328 | 386.283 |
| 94.99648876404494 | 13.989 | 59.724 | 396.429 | 401.393 |
| 95.16327247191012 | 16.164 | 60.323 | 411.834 | 416.773 |
| 95.33005617977528 | 18.313 | 60.458 | 427.551 | 432.414 |
| 95.49683988764046 | 20.453 | 60.188 | 443.479 | 448.24 |
| 95.66362359550563 | 22.636 | 59.598 | 459.575 | 464.193 |
| 95.83040730337078 | 24.852 | 58.823 | 475.941 | 480.407 |
| 95.99719101123594 | 27.06 | 57.795 | 491.81 | 496.108 |
| 96.16397471910112 | 29.159 | 56.37 | 506.65 | 510.788 |
| 96.33075842696628 | 31.181 | 54.643 | 520.901 | 524.87 |
| 96.49754213483145 | 33.153 | 52.73 | 534.089 | 537.899 |
| 96.66432584269663 | 35.083 | 50.842 | 545.753 | 549.427 |
| 96.8311095505618 | 36.743 | 49.258 | 555.781 | 559.355 |
| 96.99789325842697 | 38.108 | 47.909 | 564.605 | 568.102 |
| 97.16467696629213 | 39.305 | 46.679 | 572.324 | 575.754 |
| 97.3314606741573 | 40.502 | 45.491 | 579.302 | 582.673 |
| 97.49824438202248 | 41.479 | 44.673 | 585.656 | 588.985 |
| 97.66502808988764 | 42.347 | 43.974 | 591.378 | 594.673 |
| 97.8318117977528 | 43.139 | 43.165 | 596.308 | 599.561 |
| 97.99859550561798 | 43.755 | 42.339 | 600.707 | 603.918 |
| 98.16537921348316 | 44.193 | 41.471 | 604.441 | 607.601 |
| 98.33216292134833 | 44.336 | 40.653 | 607.078 | 610.18 |
| 98.49894662921349 | 44.058 | 39.811 | 608.149 | 611.166 |
| 98.66573033707866 | 43.645 | 38.858 | 608.073 | 610.997 |
| 98.8325140449438 | 43.173 | 37.78 | 606.927 | 609.758 |
| 98.99929775280897 | 42.415 | 36.566 | 604.516 | 607.23 |
| 99.16608146067416 | 41.513 | 35.159 | 601.971 | 604.559 |
| 99.33286516853933 | 40.569 | 33.524 | 599.991 | 602.443 |
| 99.49964887640449 | 39.566 | 31.813 | 598.87 | 601.179 |
| 99.66643258426966 | 38.622 | 30.153 | 598.66 | 600.834 |
| 99.83321629213484 | 37.847 | 28.535 | 599.182 | 601.221 |
| 100.0 | 37.24 | 27.187 | 599.679 | 601.609 |